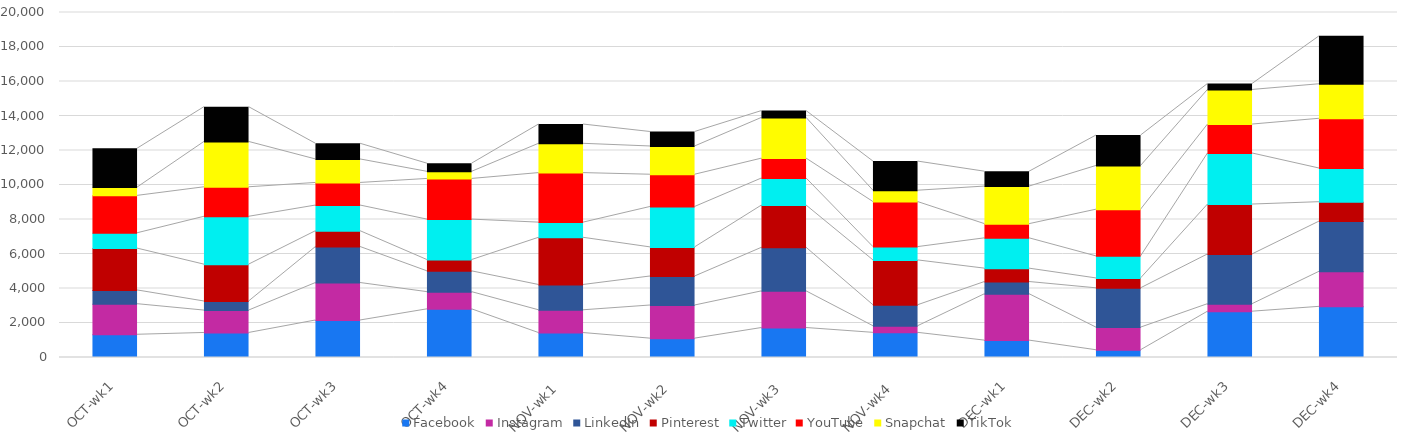
| Category | Facebook | Instagram | LinkedIn | Pinterest | Twitter | YouTube | Snapchat | TikTok |
|---|---|---|---|---|---|---|---|---|
| OCT-wk1 | 1318 | 1773 | 798 | 2424 | 889 | 2168 | 481 | 2252 |
| OCT-wk2 | 1423 | 1298 | 526 | 2136 | 2774 | 1711 | 2630 | 2015 |
| OCT-wk3 | 2146 | 2172 | 2087 | 917 | 1487 | 1310 | 1362 | 909 |
| OCT-wk4 | 2793 | 996 | 1206 | 654 | 2345 | 2358 | 412 | 472 |
| NOV-wk1 | 1418 | 1320 | 1467 | 2735 | 879 | 2871 | 1698 | 1117 |
| NOV-wk2 | 1094 | 1920 | 1682 | 1688 | 2342 | 1870 | 1637 | 840 |
| NOV-wk3 | 1710 | 2125 | 2526 | 2449 | 1569 | 1150 | 2362 | 396 |
| NOV-wk4 | 1430 | 383 | 1216 | 2600 | 772 | 2611 | 657 | 1689 |
| DEC-wk1 | 979 | 2690 | 707 | 775 | 1758 | 822 | 2179 | 861 |
| DEC-wk2 | 422 | 1311 | 2278 | 574 | 1278 | 2706 | 2536 | 1763 |
| DEC-wk3 | 2656 | 436 | 2884 | 2892 | 2959 | 1678 | 2006 | 345 |
| DEC-wk4 | 2937 | 2032 | 2908 | 1127 | 1953 | 2881 | 2002 | 2776 |